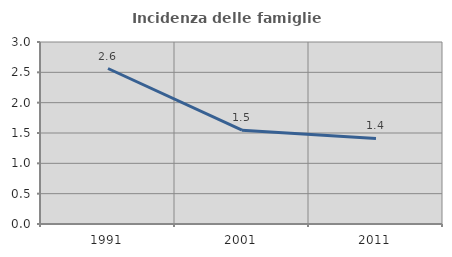
| Category | Incidenza delle famiglie numerose |
|---|---|
| 1991.0 | 2.563 |
| 2001.0 | 1.546 |
| 2011.0 | 1.409 |